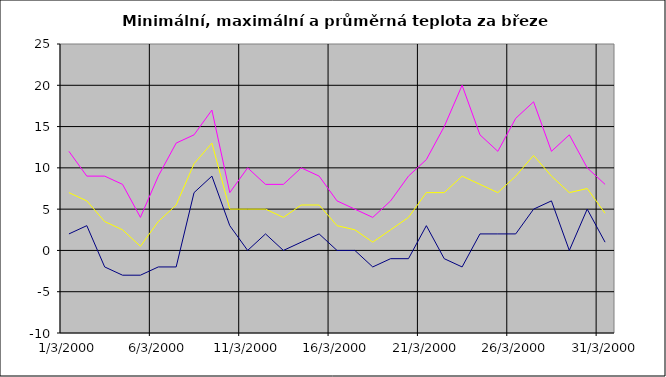
| Category | Series 0 | Series 1 | Series 2 |
|---|---|---|---|
| 2000-03-01 | 2 | 12 | 7 |
| 2000-03-02 | 3 | 9 | 6 |
| 2000-03-03 | -2 | 9 | 3.5 |
| 2000-03-04 | -3 | 8 | 2.5 |
| 2000-03-05 | -3 | 4 | 0.5 |
| 2000-03-06 | -2 | 9 | 3.5 |
| 2000-03-07 | -2 | 13 | 5.5 |
| 2000-03-08 | 7 | 14 | 10.5 |
| 2000-03-09 | 9 | 17 | 13 |
| 2000-03-10 | 3 | 7 | 5 |
| 2000-03-11 | 0 | 10 | 5 |
| 2000-03-12 | 2 | 8 | 5 |
| 2000-03-13 | 0 | 8 | 4 |
| 2000-03-14 | 1 | 10 | 5.5 |
| 2000-03-15 | 2 | 9 | 5.5 |
| 2000-03-16 | 0 | 6 | 3 |
| 2000-03-17 | 0 | 5 | 2.5 |
| 2000-03-18 | -2 | 4 | 1 |
| 2000-03-19 | -1 | 6 | 2.5 |
| 2000-03-20 | -1 | 9 | 4 |
| 2000-03-21 | 3 | 11 | 7 |
| 2000-03-22 | -1 | 15 | 7 |
| 2000-03-23 | -2 | 20 | 9 |
| 2000-03-24 | 2 | 14 | 8 |
| 2000-03-25 | 2 | 12 | 7 |
| 2000-03-26 | 2 | 16 | 9 |
| 2000-03-27 | 5 | 18 | 11.5 |
| 2000-03-28 | 6 | 12 | 9 |
| 2000-03-29 | 0 | 14 | 7 |
| 2000-03-30 | 5 | 10 | 7.5 |
| 2000-03-31 | 1 | 8 | 4.5 |